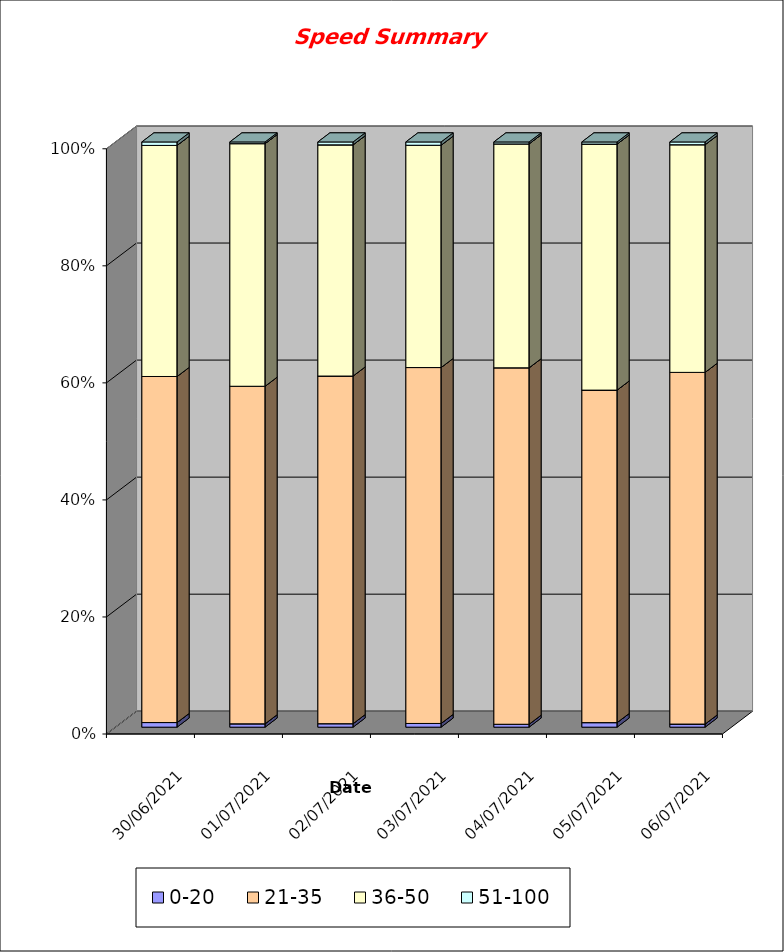
| Category | 0-20 | 21-35 | 36-50 | 51-100 |
|---|---|---|---|---|
| 30/06/2021 | 16 | 1195 | 798 | 12 |
| 01/07/2021 | 12 | 1202 | 864 | 6 |
| 02/07/2021 | 12 | 1194 | 794 | 10 |
| 03/07/2021 | 9 | 863 | 539 | 8 |
| 04/07/2021 | 6 | 737 | 463 | 4 |
| 05/07/2021 | 15 | 1096 | 811 | 7 |
| 06/07/2021 | 10 | 1137 | 736 | 9 |